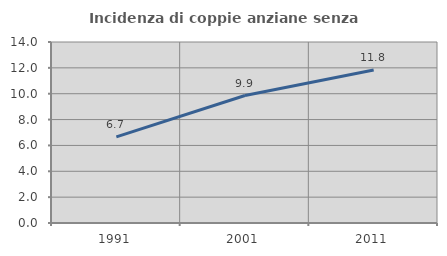
| Category | Incidenza di coppie anziane senza figli  |
|---|---|
| 1991.0 | 6.66 |
| 2001.0 | 9.859 |
| 2011.0 | 11.833 |